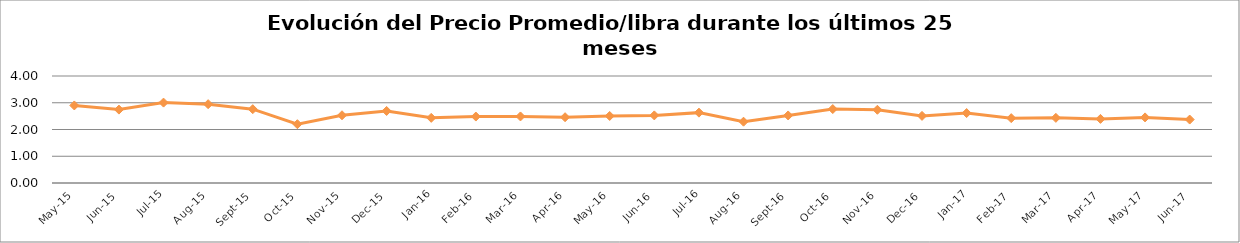
| Category | Series 0 |
|---|---|
| 2015-05-01 | 2.899 |
| 2015-06-01 | 2.744 |
| 2015-07-01 | 3.005 |
| 2015-08-01 | 2.947 |
| 2015-09-01 | 2.76 |
| 2015-10-01 | 2.198 |
| 2015-11-01 | 2.532 |
| 2015-12-01 | 2.693 |
| 2016-01-01 | 2.436 |
| 2016-02-01 | 2.484 |
| 2016-03-01 | 2.488 |
| 2016-04-01 | 2.46 |
| 2016-05-01 | 2.506 |
| 2016-06-01 | 2.527 |
| 2016-07-01 | 2.631 |
| 2016-08-01 | 2.292 |
| 2016-09-01 | 2.525 |
| 2016-10-01 | 2.764 |
| 2016-11-01 | 2.737 |
| 2016-12-01 | 2.508 |
| 2017-01-01 | 2.615 |
| 2017-02-01 | 2.424 |
| 2017-03-01 | 2.436 |
| 2017-04-01 | 2.396 |
| 2017-05-01 | 2.452 |
| 2017-06-01 | 2.372 |